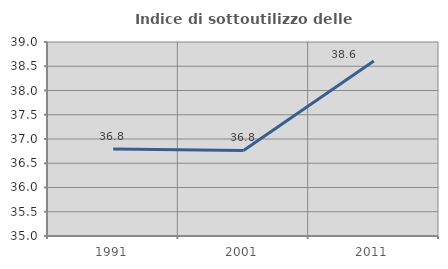
| Category | Indice di sottoutilizzo delle abitazioni  |
|---|---|
| 1991.0 | 36.795 |
| 2001.0 | 36.764 |
| 2011.0 | 38.608 |